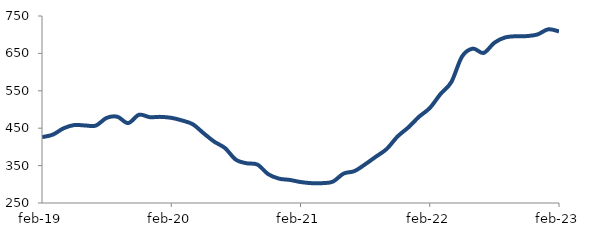
| Category | Series 0 |
|---|---|
| 2019-02-01 | 426.141 |
| 2019-03-01 | 432.718 |
| 2019-04-01 | 449.714 |
| 2019-05-01 | 458.458 |
| 2019-06-01 | 457.312 |
| 2019-07-01 | 457.058 |
| 2019-08-01 | 477.544 |
| 2019-09-01 | 480.652 |
| 2019-10-01 | 463.67 |
| 2019-11-01 | 485.887 |
| 2019-12-01 | 479.593 |
| 2020-01-01 | 480.293 |
| 2020-02-01 | 477.774 |
| 2020-03-01 | 470.708 |
| 2020-04-01 | 460.537 |
| 2020-05-01 | 436.562 |
| 2020-06-01 | 413.857 |
| 2020-07-01 | 396.652 |
| 2020-08-01 | 365.687 |
| 2020-09-01 | 356.18 |
| 2020-10-01 | 352.658 |
| 2020-11-01 | 327.164 |
| 2020-12-01 | 315.173 |
| 2021-01-01 | 311.708 |
| 2021-02-01 | 306.103 |
| 2021-03-01 | 303.075 |
| 2021-04-01 | 303.034 |
| 2021-05-01 | 306.996 |
| 2021-06-01 | 328.614 |
| 2021-07-01 | 335.232 |
| 2021-08-01 | 353.414 |
| 2021-09-01 | 373.869 |
| 2021-10-01 | 394.393 |
| 2021-11-01 | 427.592 |
| 2021-12-01 | 451.83 |
| 2022-01-01 | 480.528 |
| 2022-02-01 | 503.882 |
| 2022-03-01 | 541.428 |
| 2022-04-01 | 573.261 |
| 2022-05-01 | 641.774 |
| 2022-06-01 | 662.728 |
| 2022-07-01 | 651.267 |
| 2022-08-01 | 678.506 |
| 2022-09-01 | 692.688 |
| 2022-10-01 | 695.873 |
| 2022-11-01 | 696.235 |
| 2022-12-01 | 700.598 |
| 2023-01-01 | 714.422 |
| 2023-02-01 | 708.75 |